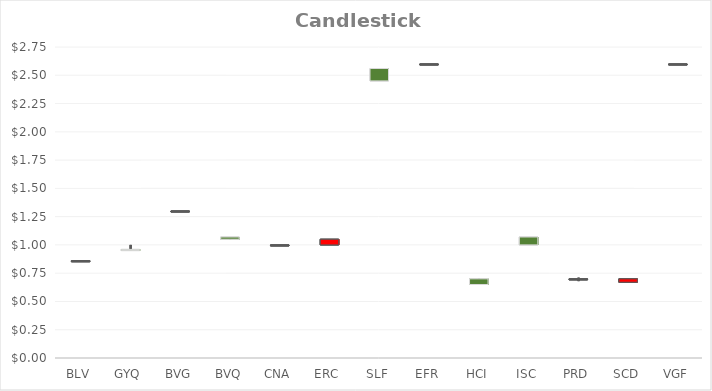
| Category | Open | High | Low | Close |
|---|---|---|---|---|
| BLV | 0.86 | 0.86 | 0.86 | 0.86 |
| GYQ | 0.95 | 1 | 0.95 | 0.96 |
| BVG | 1.3 | 1.3 | 1.3 | 1.3 |
| BVQ | 1.05 | 1.07 | 1.05 | 1.07 |
| CNA | 1 | 1 | 1 | 1 |
| ERC | 1.05 | 1.05 | 1 | 1 |
| SLF | 2.45 | 2.56 | 2.45 | 2.56 |
| EFR | 2.6 | 2.6 | 2.6 | 2.6 |
| HCI | 0.65 | 0.7 | 0.65 | 0.7 |
| ISC | 1 | 1.07 | 1 | 1.07 |
| PRD | 0.7 | 0.71 | 0.68 | 0.7 |
| SCD | 0.7 | 0.7 | 0.67 | 0.67 |
| VGF | 2.6 | 2.6 | 2.6 | 2.6 |